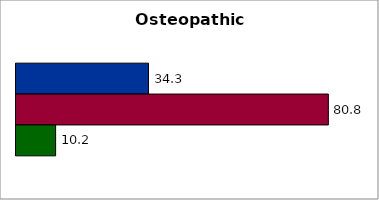
| Category | 50 states and D.C. | SREB states | State |
|---|---|---|---|
| 0 | 34.269 | 80.782 | 10.244 |